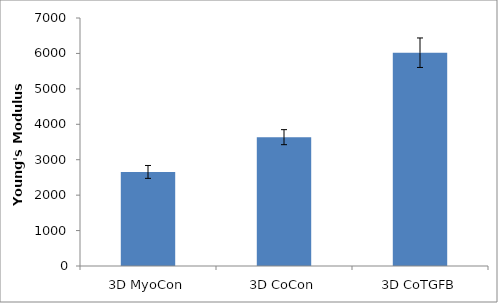
| Category | Series 0 |
|---|---|
| 3D MyoCon | 2655.523 |
| 3D CoCon | 3636.557 |
| 3D CoTGFB | 6020.316 |